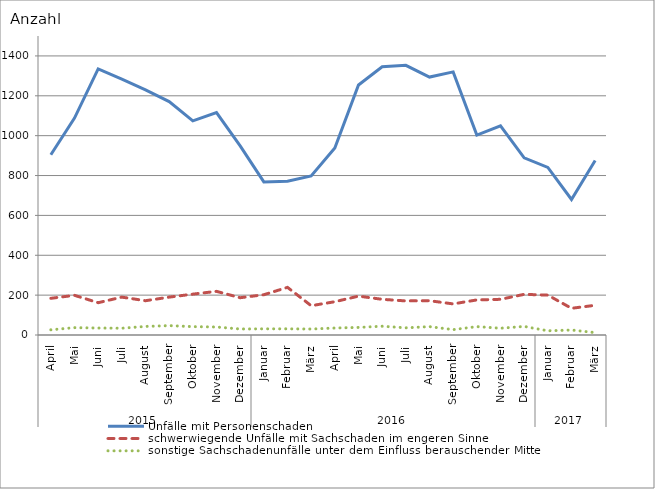
| Category | Unfälle mit Personenschaden | schwerwiegende Unfälle mit Sachschaden im engeren Sinne | sonstige Sachschadenunfälle unter dem Einfluss berauschender Mittel |
|---|---|---|---|
| 0 | 904 | 184 | 26 |
| 1 | 1088 | 199 | 37 |
| 2 | 1335 | 162 | 35 |
| 3 | 1284 | 190 | 34 |
| 4 | 1230 | 172 | 43 |
| 5 | 1171 | 190 | 47 |
| 6 | 1074 | 205 | 42 |
| 7 | 1116 | 219 | 40 |
| 8 | 949 | 187 | 30 |
| 9 | 768 | 202 | 31 |
| 10 | 771 | 239 | 31 |
| 11 | 798 | 147 | 30 |
| 12 | 938 | 167 | 35 |
| 13 | 1254 | 195 | 38 |
| 14 | 1346 | 179 | 44 |
| 15 | 1353 | 171 | 36 |
| 16 | 1294 | 172 | 42 |
| 17 | 1320 | 156 | 27 |
| 18 | 1003 | 176 | 42 |
| 19 | 1049 | 179 | 34 |
| 20 | 889 | 204 | 43 |
| 21 | 841 | 200 | 21 |
| 22 | 680 | 134 | 25 |
| 23 | 875 | 149 | 12 |